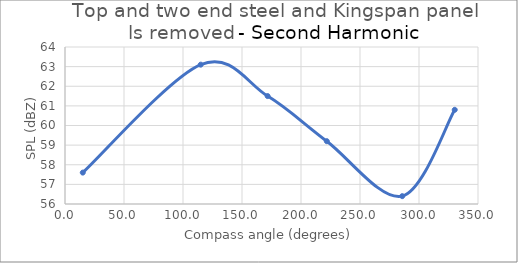
| Category | Series 0 |
|---|---|
| 15.06445125542554 | 57.6 |
| 115.00449447818254 | 63.1 |
| 171.7068171198818 | 61.5 |
| 221.8691292075067 | 59.2 |
| 285.7828166838848 | 56.4 |
| 330.28010595813004 | 60.8 |